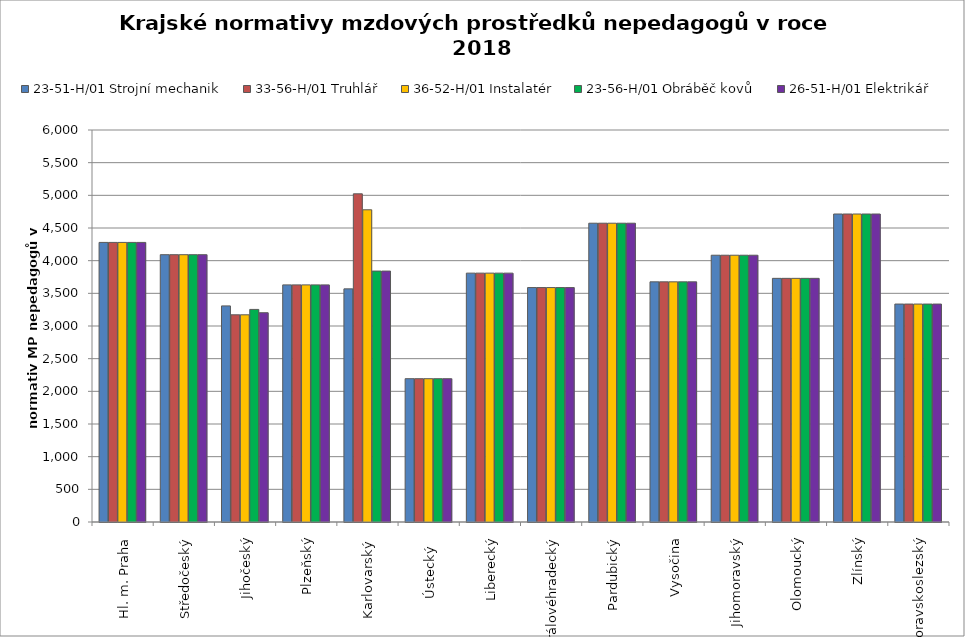
| Category | 23-51-H/01 Strojní mechanik | 33-56-H/01 Truhlář | 36-52-H/01 Instalatér | 23-56-H/01 Obráběč kovů | 26-51-H/01 Elektrikář |
|---|---|---|---|---|---|
| Hl. m. Praha | 4279.355 | 4279.355 | 4279.355 | 4279.355 | 4279.355 |
| Středočeský | 4091.438 | 4091.438 | 4091.438 | 4091.438 | 4091.438 |
| Jihočeský | 3307.558 | 3171.327 | 3171.327 | 3253.875 | 3203.355 |
| Plzeňský | 3629.455 | 3629.455 | 3629.455 | 3629.455 | 3629.455 |
| Karlovarský  | 3568.478 | 5023.256 | 4778.761 | 3840.683 | 3840.683 |
| Ústecký   | 2193.526 | 2193.526 | 2193.526 | 2193.526 | 2193.526 |
| Liberecký | 3809.239 | 3809.239 | 3809.239 | 3809.239 | 3809.239 |
| Královéhradecký | 3588.25 | 3588.25 | 3588.25 | 3588.25 | 3588.25 |
| Pardubický | 4573.309 | 4573.309 | 4573.309 | 4573.309 | 4573.309 |
| Vysočina | 3675.889 | 3675.889 | 3675.889 | 3675.889 | 3675.889 |
| Jihomoravský | 4083.182 | 4083.182 | 4083.182 | 4083.182 | 4083.182 |
| Olomoucký | 3729.225 | 3729.225 | 3729.225 | 3729.225 | 3729.225 |
| Zlínský | 4714.286 | 4714.286 | 4714.286 | 4714.286 | 4714.286 |
| Moravskoslezský | 3335.966 | 3335.966 | 3335.966 | 3335.966 | 3335.966 |